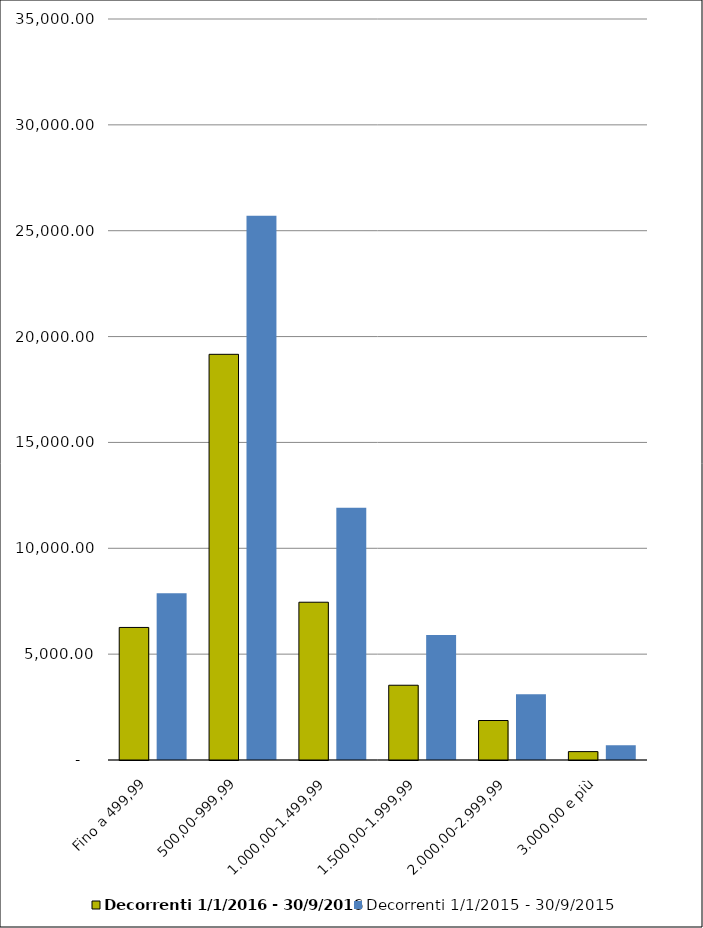
| Category | Decorrenti 1/1/2016 - 30/9/2016 | Decorrenti 1/1/2015 - 30/9/2015 |
|---|---|---|
| Fino a 499,99 | 6261 | 7878 |
| 500,00-999,99 | 19162 | 25703 |
| 1.000,00-1.499,99 | 7452 | 11918 |
| 1.500,00-1.999,99 | 3531 | 5909 |
| 2.000,00-2.999,99 | 1865 | 3100 |
| 3.000,00 e più | 396 | 697 |